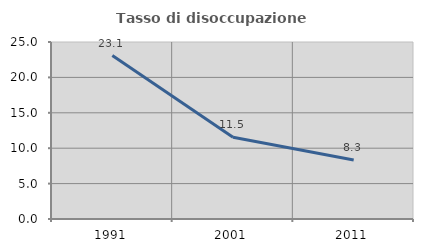
| Category | Tasso di disoccupazione giovanile  |
|---|---|
| 1991.0 | 23.077 |
| 2001.0 | 11.538 |
| 2011.0 | 8.333 |